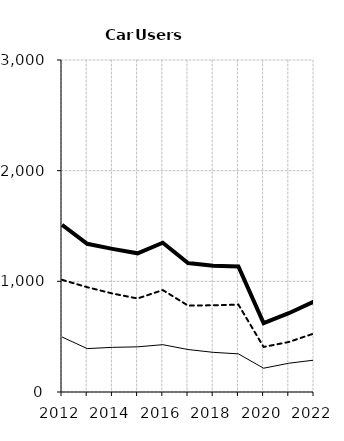
| Category | Built-up | Non built-up | Total |
|---|---|---|---|
| 2012.0 | 497.1 | 1013.7 | 1510.8 |
| 2013.0 | 392.1 | 947.1 | 1339.2 |
| 2014.0 | 403.4 | 890.2 | 1293.5 |
| 2015.0 | 408.1 | 844.9 | 1253 |
| 2016.0 | 427.6 | 921.2 | 1348.8 |
| 2017.0 | 383.8 | 780.9 | 1164.8 |
| 2018.0 | 358.4 | 783.4 | 1141.8 |
| 2019.0 | 344.4 | 789.7 | 1134.1 |
| 2020.0 | 215 | 407 | 622 |
| 2021.0 | 260 | 452 | 712 |
| 2022.0 | 288 | 529 | 817 |